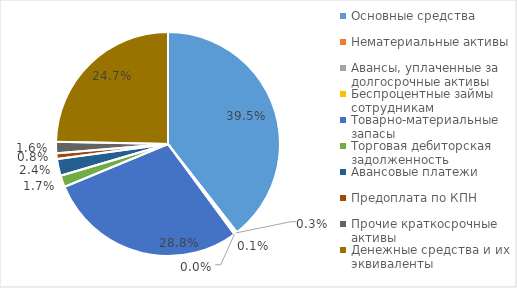
| Category | Series 0 |
|---|---|
| Основные средства | 0.395 |
| Нематериальные активы | 0.003 |
| Авансы, уплаченные за долгосрочные активы | 0.001 |
| Беспроцентные займы сотрудникам | 0 |
| Товарно-материальные запасы | 0.288 |
| Торговая дебиторская задолженность | 0.017 |
| Авансовые платежи | 0.024 |
| Предоплата по КПН | 0.008 |
| Прочие краткосрочные активы | 0.016 |
| Денежные средства и их эквиваленты | 0.247 |